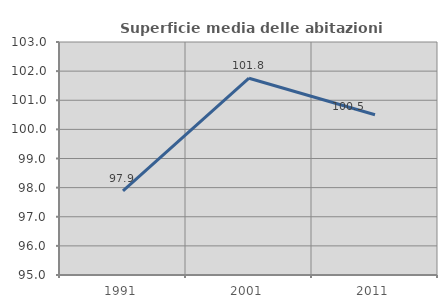
| Category | Superficie media delle abitazioni occupate |
|---|---|
| 1991.0 | 97.885 |
| 2001.0 | 101.758 |
| 2011.0 | 100.503 |